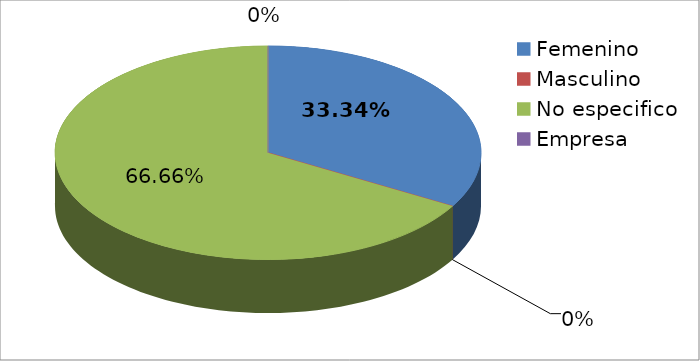
| Category | Series 0 |
|---|---|
| Femenino | 1 |
| Masculino | 0 |
| No especifico | 2 |
| Empresa | 0 |